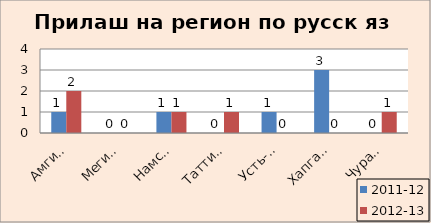
| Category | 2011-12 | 2012-13 |
|---|---|---|
| Амгинский | 1 | 2 |
| Мегино-Кангаласс | 0 | 0 |
| Намский | 1 | 1 |
| Таттинский | 0 | 1 |
| Усть-Алданский | 1 | 0 |
| Хапгаласский | 3 | 0 |
| Чурапчинский | 0 | 1 |